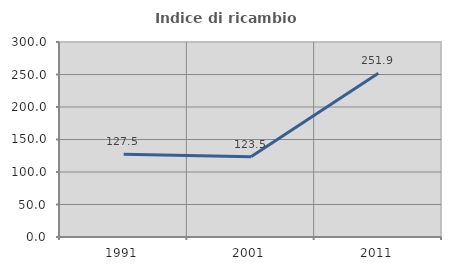
| Category | Indice di ricambio occupazionale  |
|---|---|
| 1991.0 | 127.473 |
| 2001.0 | 123.469 |
| 2011.0 | 251.948 |